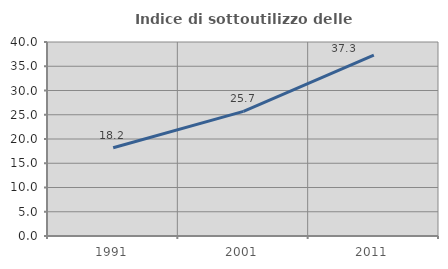
| Category | Indice di sottoutilizzo delle abitazioni  |
|---|---|
| 1991.0 | 18.185 |
| 2001.0 | 25.696 |
| 2011.0 | 37.296 |